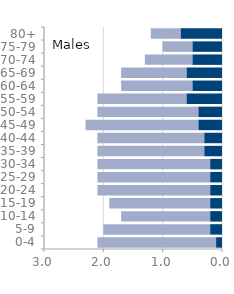
| Category | Disabled | Not disabled |
|---|---|---|
| 0-4 | 0.1 | 2 |
| 5-9 | 0.2 | 1.8 |
| 10-14 | 0.2 | 1.5 |
| 15-19 | 0.2 | 1.7 |
| 20-24 | 0.2 | 1.9 |
| 25-29 | 0.2 | 1.9 |
| 30-34 | 0.2 | 1.9 |
| 35-39 | 0.3 | 1.8 |
| 40-44 | 0.3 | 1.8 |
| 45-49 | 0.4 | 1.9 |
| 50-54 | 0.4 | 1.7 |
| 55-59 | 0.6 | 1.5 |
| 60-64 | 0.5 | 1.2 |
| 65-69 | 0.6 | 1.1 |
| 70-74 | 0.5 | 0.8 |
| 75-79 | 0.5 | 0.5 |
| 80+ | 0.7 | 0.5 |